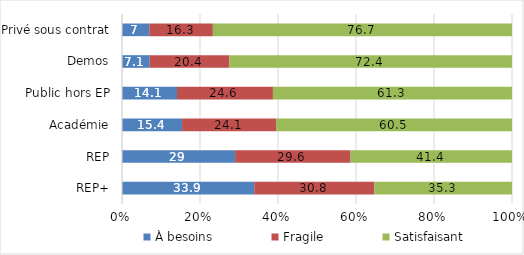
| Category | À besoins | Fragile | Satisfaisant |
|---|---|---|---|
| REP+ | 33.9 | 30.8 | 35.3 |
| REP | 29 | 29.6 | 41.4 |
| Académie | 15.4 | 24.1 | 60.5 |
| Public hors EP | 14.1 | 24.6 | 61.3 |
| Demos | 7.1 | 20.4 | 72.4 |
| Privé sous contrat | 7 | 16.3 | 76.7 |